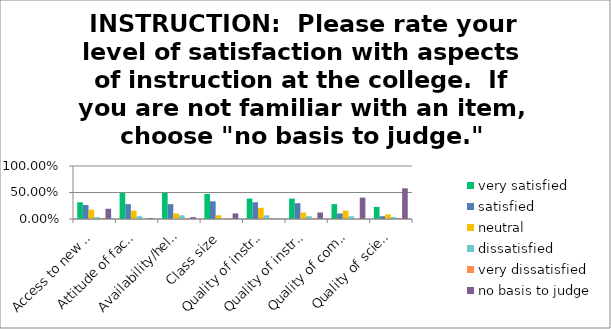
| Category | very satisfied | satisfied | neutral | dissatisfied | very dissatisfied | no basis to judge |
|---|---|---|---|---|---|---|
| Access to new technology | 0.316 | 0.263 | 0.175 | 0.035 | 0.018 | 0.193 |
| Attitude of faculty toward students | 0.491 | 0.281 | 0.158 | 0.053 | 0 | 0.018 |
| Availability/helpfulness of faculty | 0.491 | 0.281 | 0.105 | 0.07 | 0.018 | 0.035 |
| Class size | 0.474 | 0.333 | 0.07 | 0 | 0.018 | 0.105 |
| Quality of instruction overall | 0.386 | 0.316 | 0.21 | 0.07 | 0.018 | 0 |
| Quality of instruction in your major | 0.386 | 0.298 | 0.123 | 0.053 | 0.018 | 0.123 |
| Quality of computer labs | 0.281 | 0.105 | 0.158 | 0.053 | 0 | 0.404 |
| Quality of science labs | 0.228 | 0.053 | 0.088 | 0.035 | 0.018 | 0.579 |